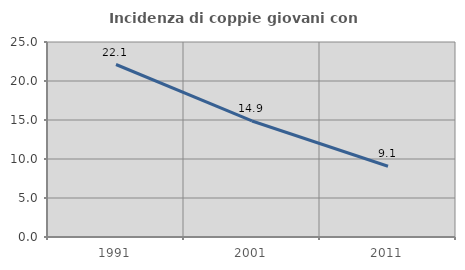
| Category | Incidenza di coppie giovani con figli |
|---|---|
| 1991.0 | 22.115 |
| 2001.0 | 14.877 |
| 2011.0 | 9.072 |